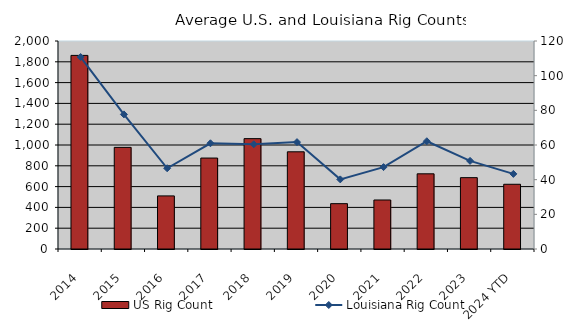
| Category | US Rig Count |
|---|---|
| 2014 | 1861.5 |
| 2015 | 977.25 |
| 2016 | 510.667 |
| 2017 | 874.5 |
| 2018 | 1061.167 |
| 2019 | 934.583 |
| 2020 | 435.917 |
| 2021 | 471.25 |
| 2022 | 722.917 |
| 2023 | 686 |
| 2024 YTD | 622.333 |